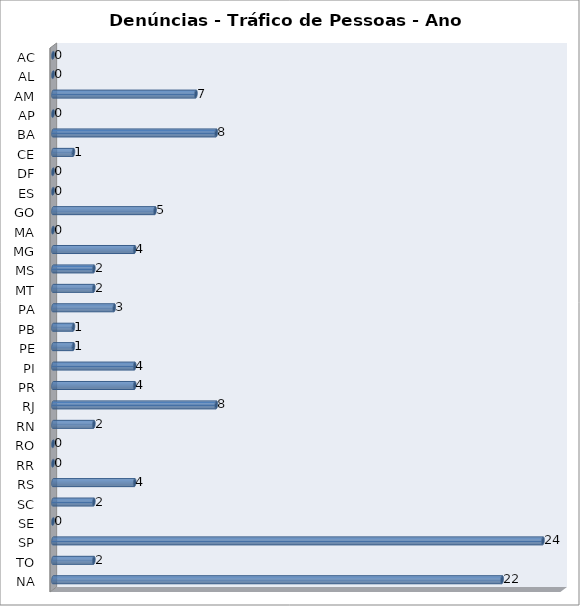
| Category | Series 0 |
|---|---|
| AC | 0 |
| AL | 0 |
| AM | 7 |
| AP | 0 |
| BA | 8 |
| CE | 1 |
| DF | 0 |
| ES | 0 |
| GO | 5 |
| MA | 0 |
| MG | 4 |
| MS | 2 |
| MT | 2 |
| PA | 3 |
| PB | 1 |
| PE | 1 |
| PI | 4 |
| PR | 4 |
| RJ | 8 |
| RN | 2 |
| RO | 0 |
| RR | 0 |
| RS | 4 |
| SC | 2 |
| SE | 0 |
| SP | 24 |
| TO | 2 |
| NA | 22 |